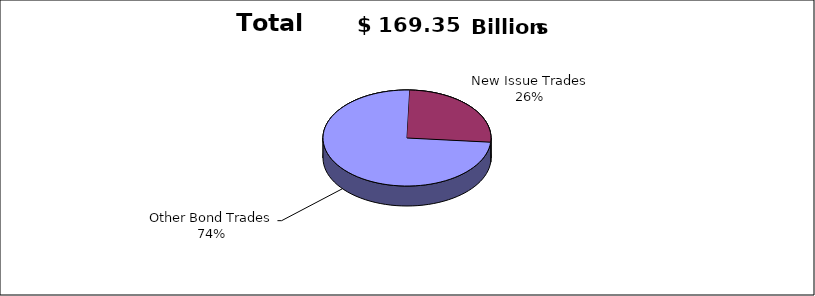
| Category | Series 0 |
|---|---|
| Other Bond Trades | 125549949158 |
| New Issue Trades | 43803453165 |